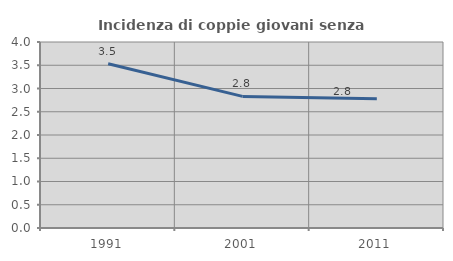
| Category | Incidenza di coppie giovani senza figli |
|---|---|
| 1991.0 | 3.532 |
| 2001.0 | 2.83 |
| 2011.0 | 2.778 |